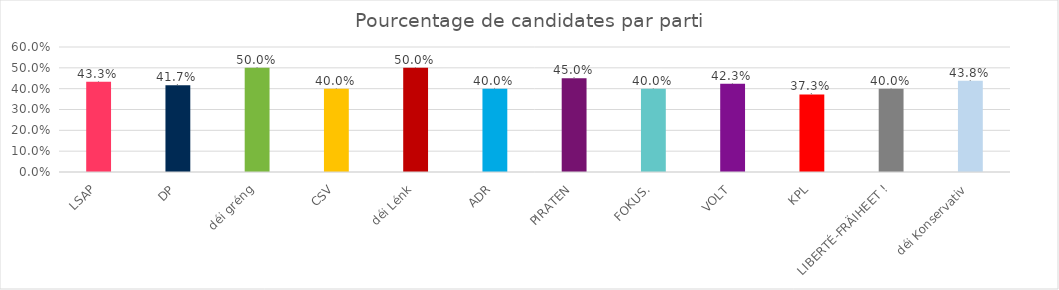
| Category | % femmes |
|---|---|
| LSAP | 0.433 |
| DP | 0.417 |
| déi gréng | 0.5 |
| CSV | 0.4 |
| déi Lénk | 0.5 |
| ADR | 0.4 |
| PIRATEN | 0.45 |
| FOKUS. | 0.4 |
| VOLT | 0.423 |
| KPL | 0.373 |
| LIBERTÉ-FRÄIHEET ! | 0.4 |
| déi Konservativ | 0.438 |